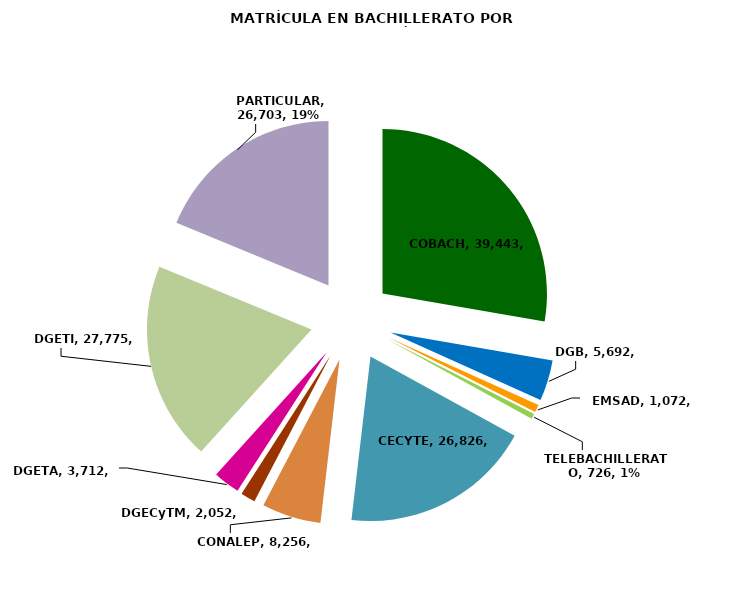
| Category |  COBACH  DGB  EMSAD  TELEBACHILLERATO  CECYTE  CONALEP  DGECyTM  DGETA  DGETI  PARTICULAR |
|---|---|
|  COBACH | 39443 |
|  DGB | 5692 |
|  EMSAD | 1072 |
|  TELEBACHILLERATO | 726 |
|  CECYTE | 26826 |
|  CONALEP | 8256 |
|  DGECyTM | 2052 |
|  DGETA | 3712 |
|  DGETI | 27775 |
|  PARTICULAR | 26703 |